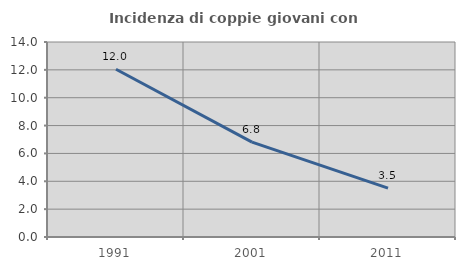
| Category | Incidenza di coppie giovani con figli |
|---|---|
| 1991.0 | 12.043 |
| 2001.0 | 6.808 |
| 2011.0 | 3.504 |